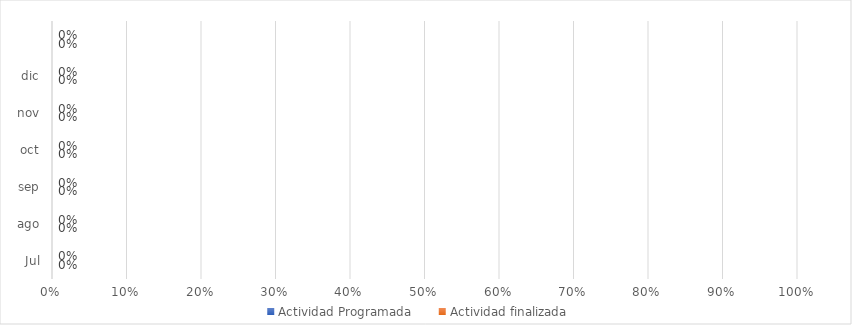
| Category | Actividad Programada | Actividad finalizada |
|---|---|---|
| Jul | 0 | 0 |
| ago | 0 | 0 |
| sep | 0 | 0 |
| oct | 0 | 0 |
| nov | 0 | 0 |
| dic | 0 | 0 |